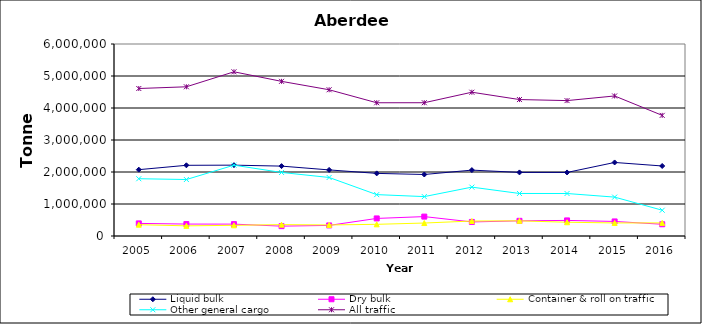
| Category | Liquid bulk | Dry bulk | Container & roll on traffic | Other general cargo | All traffic |
|---|---|---|---|---|---|
| 2005.0 | 2073000 | 394000 | 354000 | 1790000 | 4609000 |
| 2006.0 | 2209000 | 373000 | 317000 | 1765000 | 4663000 |
| 2007.0 | 2214000 | 371000 | 334000 | 2213000 | 5131000 |
| 2008.0 | 2184000 | 308000 | 355000 | 1986000 | 4833000 |
| 2009.0 | 2065366 | 330706 | 345168 | 1828821 | 4570061 |
| 2010.0 | 1957000 | 549000 | 365000 | 1293000 | 4164000 |
| 2011.0 | 1922000 | 606000 | 405000 | 1231000 | 4165000 |
| 2012.0 | 2059000 | 439000 | 468000 | 1527000 | 4493000 |
| 2013.0 | 1987000 | 474000 | 474000 | 1329000 | 4264000 |
| 2014.0 | 1986000 | 487000 | 430000 | 1328000 | 4231000 |
| 2015.0 | 2298000 | 455000 | 408000 | 1215000 | 4376000 |
| 2016.0 | 2188000 | 367000 | 409000 | 806000 | 3770000 |